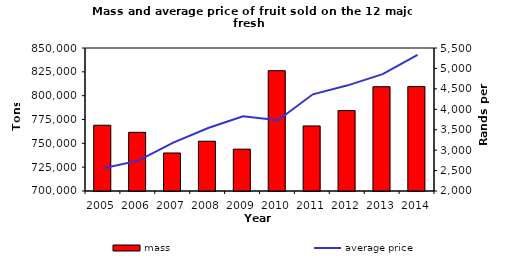
| Category | mass |
|---|---|
| 2005.0 | 768974 |
| 2006.0 | 761550 |
| 2007.0 | 739873 |
| 2008.0 | 752227 |
| 2009.0 | 743896.34 |
| 2010.0 | 826212 |
| 2011.0 | 768254 |
| 2012.0 | 784326 |
| 2013.0 | 809401 |
| 2014.0 | 809550 |